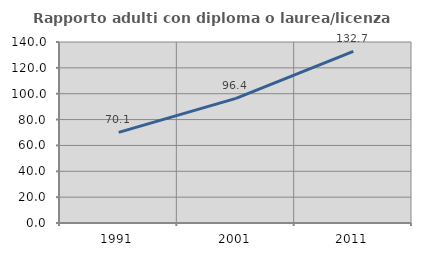
| Category | Rapporto adulti con diploma o laurea/licenza media  |
|---|---|
| 1991.0 | 70.051 |
| 2001.0 | 96.416 |
| 2011.0 | 132.727 |